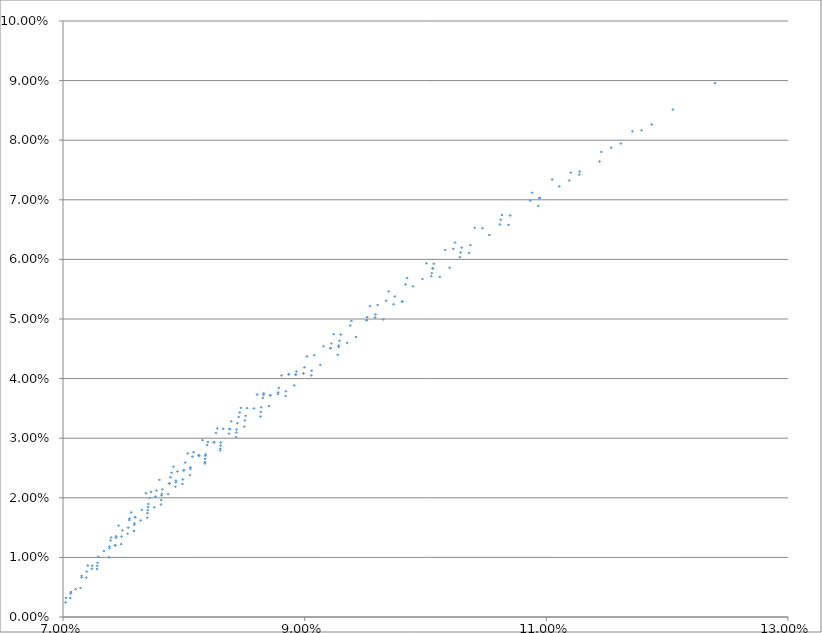
| Category | Series 0 |
|---|---|
| 0.0702513039802667 | 0.003 |
| 0.0719678887729761 | 0.008 |
| 0.07440490880886423 | 0.014 |
| 0.07652449002898426 | 0.018 |
| 0.07880061965330001 | 0.022 |
| 0.08124110099985378 | 0.027 |
| 0.08379134960049717 | 0.032 |
| 0.08715657249405988 | 0.037 |
| 0.08998286839561984 | 0.042 |
| 0.09288271723493047 | 0.046 |
| 0.09587030135235775 | 0.051 |
| 0.09975112302927798 | 0.057 |
| 0.10290761819165317 | 0.061 |
| 0.10615299794497841 | 0.066 |
| 0.10943255457879021 | 0.07 |
| 0.1127658724738136 | 0.075 |
| 0.11617265937916153 | 0.079 |
| 0.12047535421131444 | 0.085 |
| 0.12395312721153302 | 0.09 |
| 0.07205448054773332 | 0.009 |
| 0.07398515678260596 | 0.013 |
| 0.07551443753866814 | 0.017 |
| 0.07774022489577832 | 0.021 |
| 0.07947455797218686 | 0.024 |
| 0.08192694201865576 | 0.029 |
| 0.08453398062296456 | 0.034 |
| 0.08653255725113025 | 0.037 |
| 0.08930972210103783 | 0.041 |
| 0.09221200721473875 | 0.046 |
| 0.09517736582072368 | 0.05 |
| 0.09746874109776718 | 0.054 |
| 0.10059921759950279 | 0.058 |
| 0.10298604864869662 | 0.062 |
| 0.10623413696130488 | 0.067 |
| 0.10867326650539645 | 0.07 |
| 0.1120205406410636 | 0.075 |
| 0.11455708479625089 | 0.078 |
| 0.11711999245248421 | 0.081 |
| 0.07459676066410467 | 0.015 |
| 0.07563506670565524 | 0.018 |
| 0.077285468886461 | 0.021 |
| 0.07898780034823961 | 0.024 |
| 0.08080433711874097 | 0.028 |
| 0.08266290620105285 | 0.031 |
| 0.08462453700236337 | 0.034 |
| 0.0866193609351912 | 0.038 |
| 0.0886761313543277 | 0.041 |
| 0.09155742838974065 | 0.045 |
| 0.09377157464471352 | 0.049 |
| 0.09603383014808428 | 0.052 |
| 0.09834087480813056 | 0.056 |
| 0.10068962998591827 | 0.059 |
| 0.10229917559642257 | 0.062 |
| 0.10471134161001933 | 0.065 |
| 0.10632764695687023 | 0.067 |
| 0.108830120377524 | 0.071 |
| 0.11048153679602782 | 0.073 |
| 0.0768643400437045 | 0.021 |
| 0.07798118616007889 | 0.023 |
| 0.07913540459594132 | 0.025 |
| 0.08032538432678442 | 0.027 |
| 0.08154955986993255 | 0.03 |
| 0.08276789906226352 | 0.032 |
| 0.08473059904208075 | 0.035 |
| 0.08606305632723474 | 0.037 |
| 0.08809516645286922 | 0.041 |
| 0.0901865189345126 | 0.044 |
| 0.09240310695380989 | 0.047 |
| 0.0938731681148428 | 0.05 |
| 0.09540122289505656 | 0.052 |
| 0.09695042405864042 | 0.055 |
| 0.09848103741202081 | 0.057 |
| 0.1000685665207694 | 0.059 |
| 0.1016351237237595 | 0.062 |
| 0.10244417861847194 | 0.063 |
| 0.10407501990268718 | 0.065 |
| 0.07104181811022658 | 0.005 |
| 0.07285385654374071 | 0.009 |
| 0.07431718702166193 | 0.012 |
| 0.07589614799221092 | 0.015 |
| 0.07698716073838484 | 0.017 |
| 0.07812536544903713 | 0.02 |
| 0.07930025709658897 | 0.022 |
| 0.08050286554395684 | 0.024 |
| 0.08174626602977376 | 0.026 |
| 0.08302168933407988 | 0.028 |
| 0.08500386039731188 | 0.032 |
| 0.08704309851695459 | 0.035 |
| 0.0891425180257672 | 0.039 |
| 0.09129796736002152 | 0.042 |
| 0.09425682635707754 | 0.047 |
| 0.0980780187056621 | 0.053 |
| 0.10200125640018512 | 0.059 |
| 0.10686951691413202 | 0.066 |
| 0.11440596445579837 | 0.076 |
| 0.07241842374290591 | 0.009 |
| 0.07385587390214059 | 0.012 |
| 0.07539159952861553 | 0.015 |
| 0.07703438630217524 | 0.018 |
| 0.07817277025553271 | 0.021 |
| 0.07934781400232574 | 0.023 |
| 0.08055791336375862 | 0.025 |
| 0.08180151260917949 | 0.027 |
| 0.08373440674374842 | 0.031 |
| 0.08505526718578012 | 0.033 |
| 0.08779809849050835 | 0.038 |
| 0.08990223870895202 | 0.041 |
| 0.09282067216039538 | 0.046 |
| 0.09582799215497673 | 0.05 |
| 0.10047758927793668 | 0.057 |
| 0.10528370732444138 | 0.064 |
| 0.11106912460705709 | 0.072 |
| 0.11872673840814545 | 0.083 |
| 0.07065353802156435 | 0.004 |
| 0.07291615781149502 | 0.01 |
| 0.07438535953695014 | 0.013 |
| 0.0759694096506289 | 0.017 |
| 0.07764382458022129 | 0.02 |
| 0.07880061965330001 | 0.022 |
| 0.07999325009709089 | 0.025 |
| 0.08124110099985378 | 0.027 |
| 0.08250060156898655 | 0.029 |
| 0.08379134960049717 | 0.032 |
| 0.08511192347463759 | 0.034 |
| 0.08715657249405988 | 0.037 |
| 0.08926107518861395 | 0.041 |
| 0.09213783140977025 | 0.045 |
| 0.09512720686327353 | 0.05 |
| 0.09896073392412676 | 0.055 |
| 0.10371919846963223 | 0.062 |
| 0.10943255457879021 | 0.07 |
| 0.11788078091698924 | 0.082 |
| 0.07154922489959493 | 0.007 |
| 0.073934141715875 | 0.013 |
| 0.07548911442822814 | 0.016 |
| 0.07716229562051663 | 0.02 |
| 0.07889646543179175 | 0.023 |
| 0.08011689648027714 | 0.026 |
| 0.08071138366666258 | 0.027 |
| 0.08198304275411526 | 0.029 |
| 0.08325748408923714 | 0.032 |
| 0.08392117909306383 | 0.033 |
| 0.08524073533619217 | 0.035 |
| 0.08658873981061992 | 0.037 |
| 0.0886761313543277 | 0.041 |
| 0.09079063835171257 | 0.044 |
| 0.09298749555829935 | 0.047 |
| 0.09674693753537335 | 0.053 |
| 0.10059921759950279 | 0.058 |
| 0.10700641813324305 | 0.067 |
| 0.07060412248343567 | 0.003 |
| 0.07144970174988685 | 0.005 |
| 0.07282377900845292 | 0.008 |
| 0.07379537221606226 | 0.01 |
| 0.07481296945701715 | 0.012 |
| 0.07587234066837387 | 0.014 |
| 0.07697176104956162 | 0.017 |
| 0.0781095394986785 | 0.019 |
| 0.07988611747973243 | 0.022 |
| 0.08174060297569982 | 0.026 |
| 0.08301590921494492 | 0.028 |
| 0.08432179096644442 | 0.03 |
| 0.08633771047153081 | 0.034 |
| 0.0884153768905518 | 0.037 |
| 0.09055054000659603 | 0.041 |
| 0.09273922861351257 | 0.044 |
| 0.09650318925454546 | 0.05 |
| 0.10118679331896778 | 0.057 |
| 0.07020811944169636 | 0.002 |
| 0.07191387831528873 | 0.007 |
| 0.07283478631207142 | 0.009 |
| 0.07431718702166193 | 0.012 |
| 0.07534859203643386 | 0.014 |
| 0.07642859953723131 | 0.016 |
| 0.07754778896669966 | 0.018 |
| 0.07870448882418904 | 0.021 |
| 0.07990530288675526 | 0.023 |
| 0.08176298022857266 | 0.027 |
| 0.0830385548415543 | 0.029 |
| 0.08434468854374587 | 0.031 |
| 0.08636350734428912 | 0.034 |
| 0.08844392076128266 | 0.038 |
| 0.09058168491480129 | 0.041 |
| 0.09351913006901008 | 0.046 |
| 0.0980780187056621 | 0.053 |
| 0.10361377416029825 | 0.061 |
| 0.11272023380545038 | 0.074 |
| 0.07063806853314519 | 0.004 |
| 0.07238932865561093 | 0.008 |
| 0.0738412668469935 | 0.012 |
| 0.07484692291866515 | 0.014 |
| 0.0759069361818709 | 0.016 |
| 0.07700696261830126 | 0.018 |
| 0.07815810297506255 | 0.02 |
| 0.07933315042315459 | 0.023 |
| 0.08054325975844957 | 0.025 |
| 0.0817868746806177 | 0.027 |
| 0.08306249026233743 | 0.029 |
| 0.08436865500996511 | 0.031 |
| 0.08640459663937572 | 0.035 |
| 0.08778108227763982 | 0.037 |
| 0.08990223870895202 | 0.041 |
| 0.09280314662851837 | 0.045 |
| 0.09735248552560935 | 0.052 |
| 0.10284198226284517 | 0.06 |
| 0.11189290190383736 | 0.073 |
| 0.07152960567961815 | 0.007 |
| 0.07338851679567893 | 0.011 |
| 0.07490937580874099 | 0.015 |
| 0.0759694096506289 | 0.017 |
| 0.07706942365378598 | 0.019 |
| 0.07822802162839344 | 0.021 |
| 0.07880061965330001 | 0.022 |
| 0.07999325009709089 | 0.025 |
| 0.08124110099985378 | 0.027 |
| 0.08250060156898655 | 0.029 |
| 0.08379134960049717 | 0.032 |
| 0.08443744369556484 | 0.033 |
| 0.08579387843310436 | 0.035 |
| 0.08785915825268974 | 0.038 |
| 0.08926107518861395 | 0.041 |
| 0.09213783140977025 | 0.045 |
| 0.09512720686327353 | 0.05 |
| 0.1005218749567875 | 0.058 |
| 0.10943255457879021 | 0.07 |
| 0.07065353802156435 | 0.004 |
| 0.11536182272548917 | 0.079 |
| 0.1093265692730168 | 0.069 |